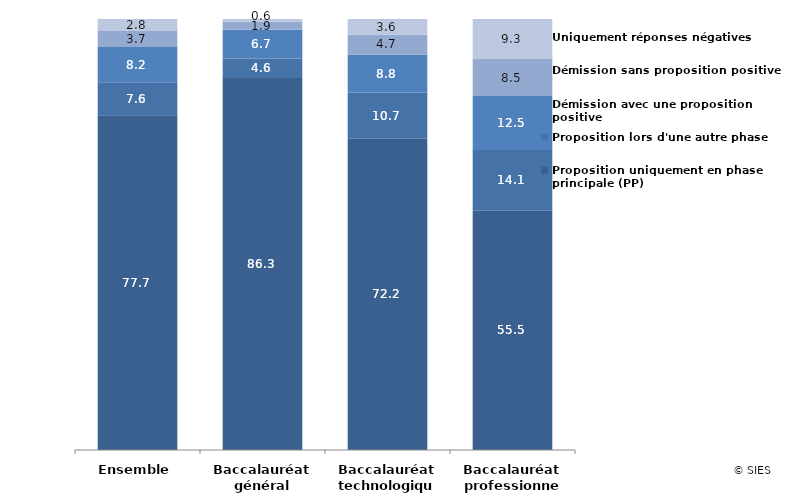
| Category | Proposition uniquement en phase principale (PP) | Proposition lors d'une autre phase | Démission avec une proposition positive | Démission sans proposition positive | Uniquement réponses négatives |
|---|---|---|---|---|---|
| Ensemble | 77.67 | 7.643 | 8.189 | 3.686 | 2.812 |
| Baccalauréat général | 86.303 | 4.56 | 6.665 | 1.874 | 0.598 |
| Baccalauréat technologique | 72.192 | 10.741 | 8.812 | 4.68 | 3.575 |
| Baccalauréat professionnel | 55.536 | 14.09 | 12.531 | 8.533 | 9.309 |